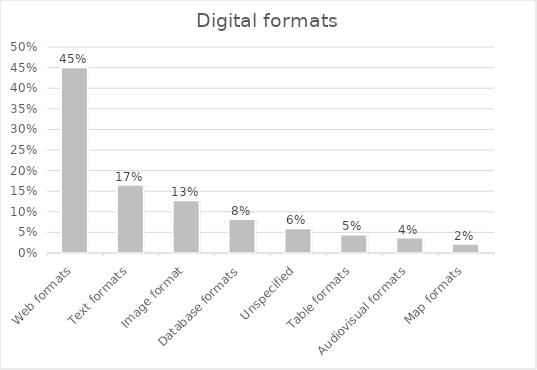
| Category | % |
|---|---|
| Web formats | 0.451 |
| Text formats | 0.165 |
| Image format | 0.128 |
| Database formats | 0.083 |
| Unspecified | 0.06 |
| Table formats | 0.045 |
| Audiovisual formats | 0.038 |
| Map formats | 0.023 |